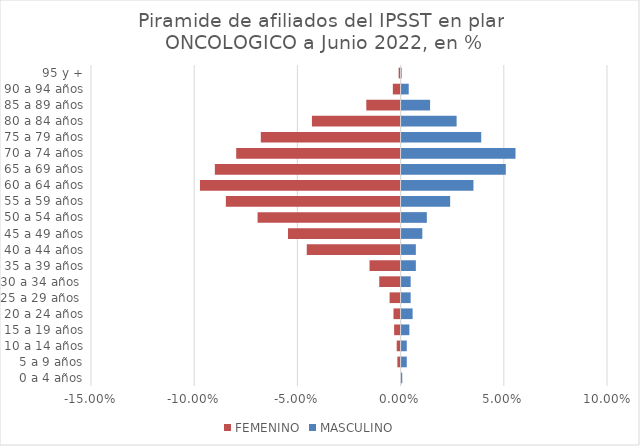
| Category | FEMENINO | MASCULINO |
|---|---|---|
| 0 a 4 años | 0 | 0 |
| 5 a 9 años | -0.002 | 0.003 |
| 10 a 14 años | -0.002 | 0.003 |
| 15 a 19 años | -0.003 | 0.004 |
| 20 a 24 años | -0.003 | 0.005 |
| 25 a 29 años  | -0.005 | 0.004 |
| 30 a 34 años  | -0.01 | 0.004 |
| 35 a 39 años | -0.015 | 0.007 |
| 40 a 44 años | -0.045 | 0.007 |
| 45 a 49 años | -0.055 | 0.01 |
| 50 a 54 años | -0.069 | 0.012 |
| 55 a 59 años | -0.085 | 0.024 |
| 60 a 64 años | -0.097 | 0.035 |
| 65 a 69 años | -0.09 | 0.05 |
| 70 a 74 años | -0.08 | 0.055 |
| 75 a 79 años | -0.068 | 0.039 |
| 80 a 84 años | -0.043 | 0.027 |
| 85 a 89 años | -0.017 | 0.014 |
| 90 a 94 años | -0.004 | 0.003 |
| 95 y + | -0.001 | 0 |